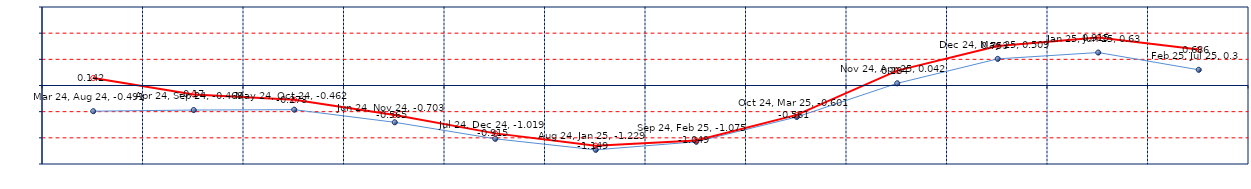
| Category | Last | Historical |
|---|---|---|
| Mar 24, Aug 24 | -0.491 | 0.142 |
| Apr 24, Sep 24 | -0.469 | -0.17 |
| May 24, Oct 24 | -0.462 | -0.273 |
| Jun 24, Nov 24 | -0.703 | -0.565 |
| Jul 24, Dec 24 | -1.019 | -0.915 |
| Aug 24, Jan 25 | -1.229 | -1.149 |
| Sep 24, Feb 25 | -1.075 | -1.049 |
| Oct 24, Mar 25 | -0.601 | -0.561 |
| Nov 24, Apr 25 | 0.042 | 0.284 |
| Dec 24, May 25 | 0.509 | 0.753 |
| Jan 25, Jun 25 | 0.63 | 0.915 |
| Feb 25, Jul 25 | 0.3 | 0.686 |